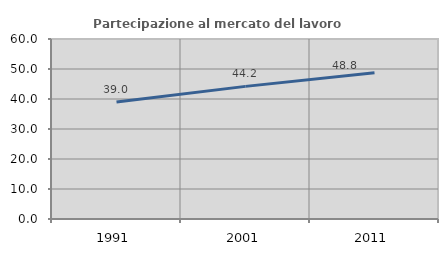
| Category | Partecipazione al mercato del lavoro  femminile |
|---|---|
| 1991.0 | 38.976 |
| 2001.0 | 44.206 |
| 2011.0 | 48.778 |